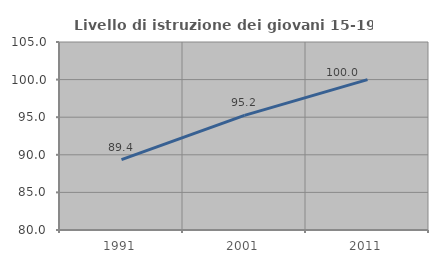
| Category | Livello di istruzione dei giovani 15-19 anni |
|---|---|
| 1991.0 | 89.362 |
| 2001.0 | 95.238 |
| 2011.0 | 100 |